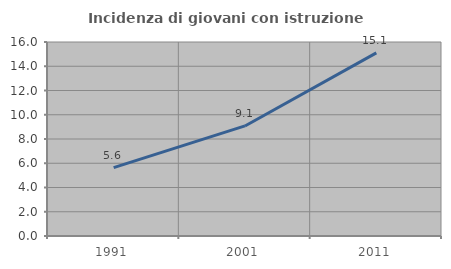
| Category | Incidenza di giovani con istruzione universitaria |
|---|---|
| 1991.0 | 5.643 |
| 2001.0 | 9.077 |
| 2011.0 | 15.105 |